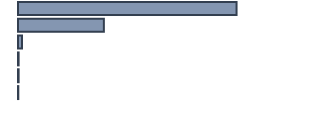
| Category | Series 0 |
|---|---|
| 0 | 70.5 |
| 1 | 27.7 |
| 2 | 1.3 |
| 3 | 0.2 |
| 4 | 0.2 |
| 5 | 0.1 |